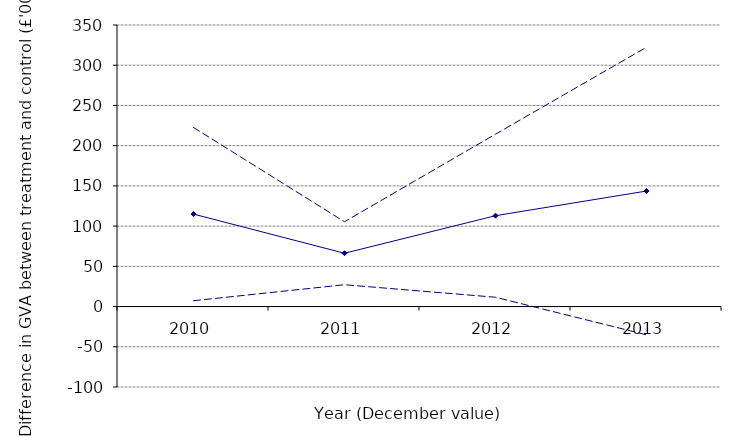
| Category | Mean diff | 5% | 95% |
|---|---|---|---|
| 2010.0 | 114.928 | 7.259 | 222.597 |
| 2011.0 | 66.273 | 27.133 | 105.414 |
| 2012.0 | 112.948 | 11.571 | 214.326 |
| 2013.0 | 143.599 | -35.175 | 322.372 |